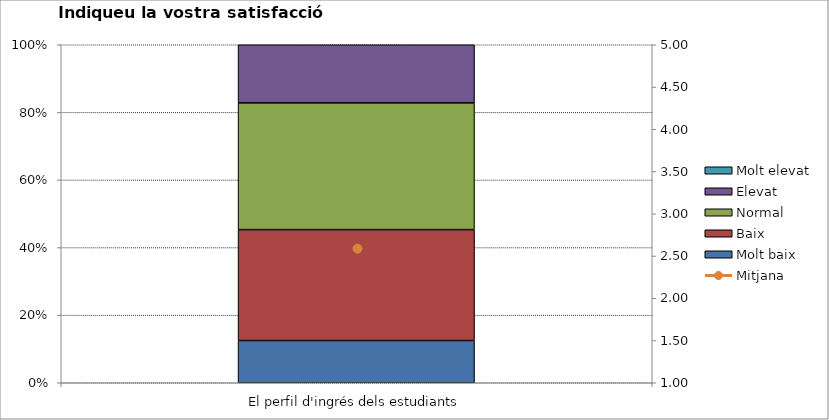
| Category | Molt baix | Baix | Normal  | Elevat | Molt elevat |
|---|---|---|---|---|---|
| El perfil d'ingrés dels estudiants | 8 | 21 | 24 | 11 | 0 |